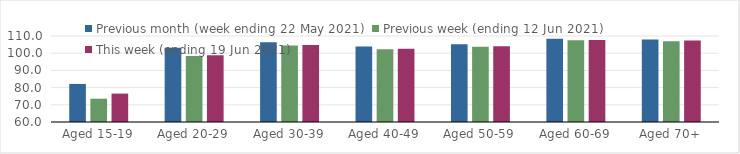
| Category | Previous month (week ending 22 May 2021) | Previous week (ending 12 Jun 2021) | This week (ending 19 Jun 2021) |
|---|---|---|---|
| Aged 15-19 | 82.13 | 73.54 | 76.51 |
| Aged 20-29 | 103.12 | 98.35 | 98.78 |
| Aged 30-39 | 106.31 | 104.53 | 104.72 |
| Aged 40-49 | 103.9 | 102.26 | 102.59 |
| Aged 50-59 | 105.15 | 103.79 | 104.09 |
| Aged 60-69 | 108.33 | 107.5 | 107.67 |
| Aged 70+ | 107.98 | 106.99 | 107.32 |